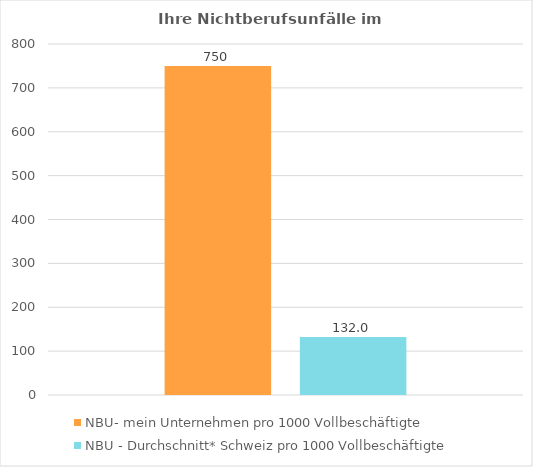
| Category | NBU- mein Unternehmen pro 1000 Vollbeschäftigte | NBU - Durchschnitt* Schweiz pro 1000 Vollbeschäftigte |
|---|---|---|
| 0 | 750 | 132 |